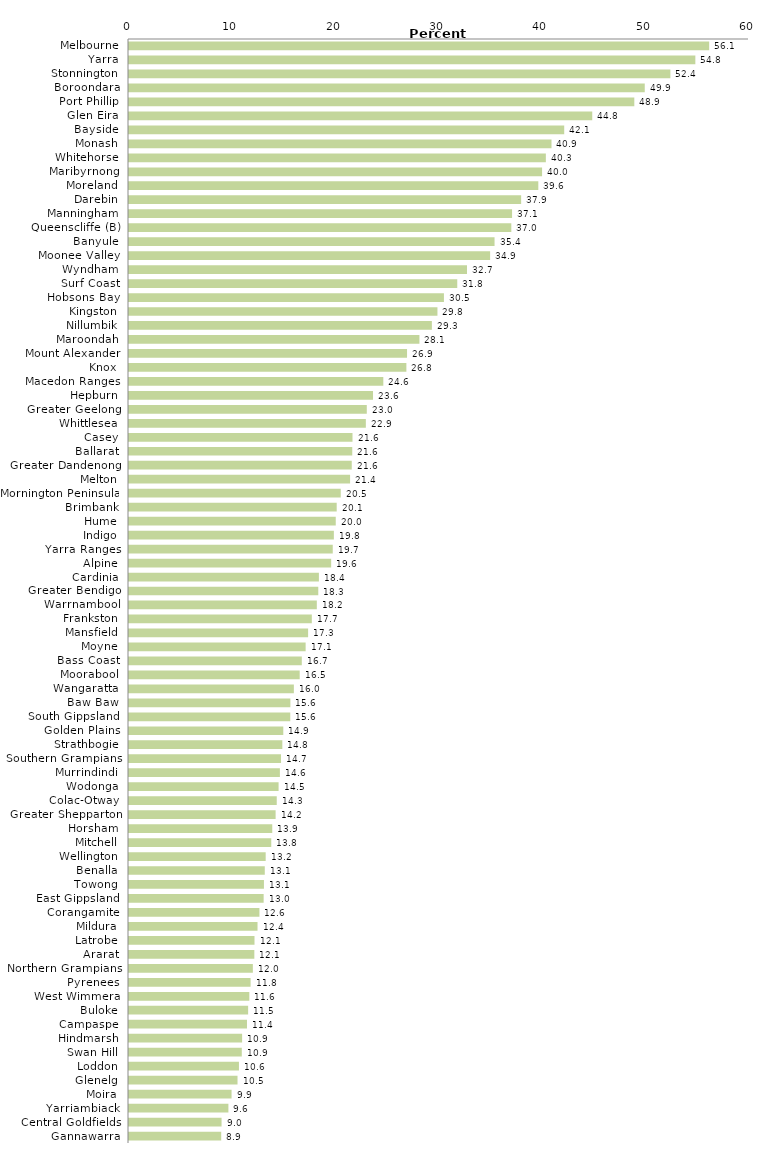
| Category | Series 0 |
|---|---|
| Melbourne | 56.146 |
| Yarra | 54.808 |
| Stonnington | 52.392 |
| Boroondara | 49.912 |
| Port Phillip | 48.901 |
| Glen Eira | 44.831 |
| Bayside | 42.117 |
| Monash | 40.886 |
| Whitehorse | 40.34 |
| Maribyrnong | 39.975 |
| Moreland | 39.61 |
| Darebin | 37.949 |
| Manningham | 37.07 |
| Queenscliffe (B) | 36.998 |
| Banyule | 35.376 |
| Moonee Valley | 34.947 |
| Wyndham | 32.71 |
| Surf Coast | 31.767 |
| Hobsons Bay | 30.477 |
| Kingston | 29.85 |
| Nillumbik | 29.311 |
| Maroondah | 28.107 |
| Mount Alexander | 26.907 |
| Knox | 26.843 |
| Macedon Ranges | 24.611 |
| Hepburn | 23.614 |
| Greater Geelong | 23.012 |
| Whittlesea | 22.92 |
| Casey | 21.629 |
| Ballarat | 21.606 |
| Greater Dandenong | 21.558 |
| Melton | 21.396 |
| Mornington Peninsula | 20.491 |
| Brimbank | 20.1 |
| Hume | 20.008 |
| Indigo | 19.825 |
| Yarra Ranges | 19.718 |
| Alpine | 19.565 |
| Cardinia | 18.377 |
| Greater Bendigo | 18.317 |
| Warrnambool | 18.176 |
| Frankston | 17.691 |
| Mansfield | 17.333 |
| Moyne | 17.093 |
| Bass Coast | 16.722 |
| Moorabool | 16.52 |
| Wangaratta | 15.954 |
| Baw Baw | 15.617 |
| South Gippsland | 15.606 |
| Golden Plains | 14.931 |
| Strathbogie | 14.838 |
| Southern Grampians | 14.711 |
| Murrindindi | 14.602 |
| Wodonga | 14.476 |
| Colac-Otway | 14.298 |
| Greater Shepparton | 14.188 |
| Horsham | 13.864 |
| Mitchell | 13.767 |
| Wellington | 13.227 |
| Benalla | 13.14 |
| Towong | 13.059 |
| East Gippsland | 13.03 |
| Corangamite | 12.623 |
| Mildura | 12.438 |
| Latrobe | 12.146 |
| Ararat | 12.129 |
| Northern Grampians | 11.985 |
| Pyrenees | 11.767 |
| West Wimmera | 11.645 |
| Buloke | 11.528 |
| Campaspe | 11.418 |
| Hindmarsh | 10.947 |
| Swan Hill | 10.914 |
| Loddon | 10.639 |
| Glenelg | 10.502 |
| Moira | 9.925 |
| Yarriambiack | 9.619 |
| Central Goldfields | 8.958 |
| Gannawarra | 8.923 |